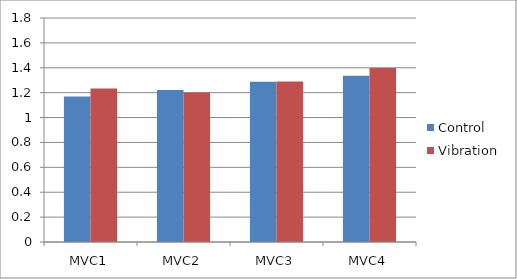
| Category | Control | Vibration |
|---|---|---|
| MVC1 | 1.169 | 1.234 |
| MVC2 | 1.222 | 1.201 |
| MVC3 | 1.287 | 1.289 |
| MVC4 | 1.336 | 1.398 |